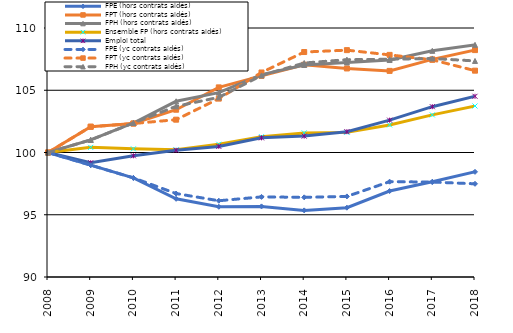
| Category | FPE (hors contrats aidés) | FPT (hors contrats aidés) | FPH (hors contrats aidés) | Ensemble FP (hors contrats aidés) | Emploi total | FPE (yc contrats aidés) | FPT (yc contrats aidés) | FPH (yc contrats aidés) |
|---|---|---|---|---|---|---|---|---|
| 2008.0 | 100 | 100 | 100 | 100 | 100 | 100 | 100 | 100 |
| 2009.0 | 98.983 | 102.07 | 101.012 | 100.412 | 99.177 | 98.983 | 102.07 | 101.012 |
| 2010.0 | 97.96 | 102.327 | 102.372 | 100.293 | 99.735 | 97.96 | 102.327 | 102.372 |
| 2011.0 | 96.279 | 103.436 | 104.112 | 100.225 | 100.178 | 96.704 | 102.636 | 103.708 |
| 2012.0 | 95.641 | 105.231 | 104.808 | 100.659 | 100.491 | 96.124 | 104.328 | 104.431 |
| 2013.0 | 95.67 | 106.153 | 106.257 | 101.27 | 101.177 | 96.434 | 106.428 | 106.19 |
| 2014.0 | 95.35 | 107.052 | 107.03 | 101.574 | 101.317 | 96.399 | 108.07 | 107.188 |
| 2015.0 | 95.568 | 106.75 | 107.232 | 101.616 | 101.673 | 96.473 | 108.222 | 107.458 |
| 2016.0 | 96.903 | 106.556 | 107.428 | 102.216 | 102.598 | 97.657 | 107.84 | 107.492 |
| 2017.0 | 97.649 | 107.48 | 108.166 | 103.02 | 103.679 | 97.626 | 107.445 | 107.553 |
| 2018.0 | 98.447 | 108.225 | 108.646 | 103.736 | 104.514 | 97.486 | 106.573 | 107.354 |